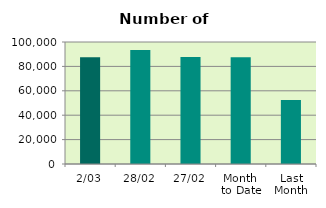
| Category | Series 0 |
|---|---|
| 2/03 | 87582 |
| 28/02 | 93456 |
| 27/02 | 87640 |
| Month 
to Date | 87582 |
| Last
Month | 52501.6 |